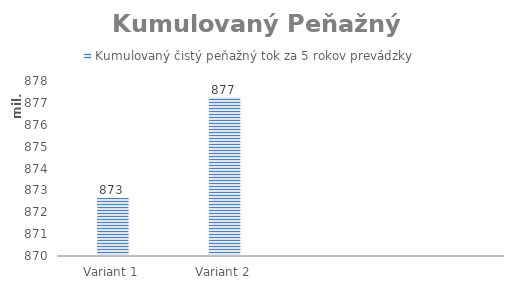
| Category | Kumulovaný čistý peňažný tok za 5 rokov prevádzky |
|---|---|
| Variant 1 | 872666374.669 |
| Variant 2 | 877242245.77 |